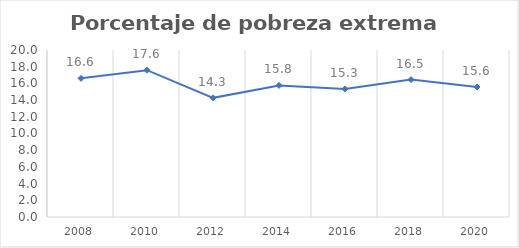
| Category | Series 0 |
|---|---|
| 2008.0 | 16.607 |
| 2010.0 | 17.581 |
| 2012.0 | 14.27 |
| 2014.0 | 15.757 |
| 2016.0 | 15.341 |
| 2018.0 | 16.456 |
| 2020.0 | 15.569 |